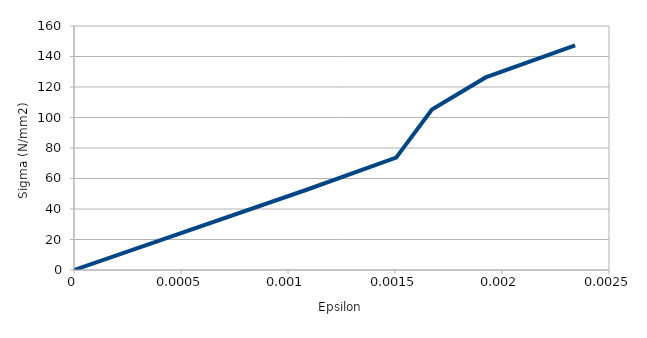
| Category | contrainte sigma (N/mm2) |
|---|---|
| 0.0 | 0 |
| 0.0010872292381031948 | 52.613 |
| 0.0015053943296812666 | 73.658 |
| 0.0016726603663125845 | 105.226 |
| 0.001923559421259487 | 126.272 |
| 0.0023417245128375588 | 147.317 |